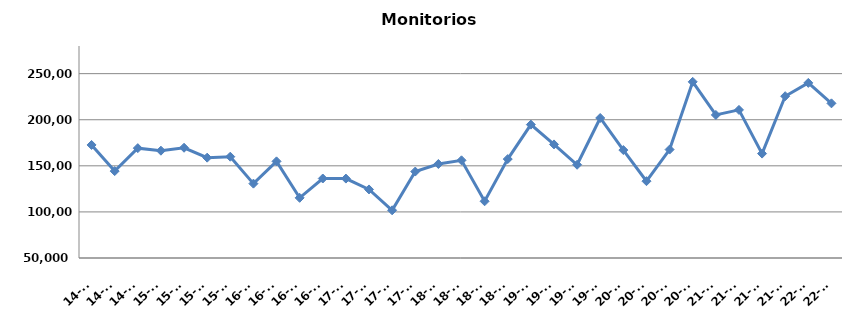
| Category | Monitorios ingresados |
|---|---|
| 14-T2 | 172648 |
| 14-T3 | 144262 |
| 14-T4 | 169174 |
| 15-T1 | 166433 |
| 15-T2 | 169612 |
| 15-T3 | 158859 |
| 15-T4 | 159890 |
| 16-T1 | 130680 |
| 16-T2 | 154860 |
| 16-T3 | 115269 |
| 16-T4 | 136245 |
| 17-T1 | 136155 |
| 17-T2 | 124382 |
| 17-T3 | 101751 |
| 17-T4 | 143788 |
| 18-T1 | 151974 |
| 18-T2 | 155991 |
| 18-T3 | 111544 |
| 18-T4 | 157337 |
| 19-T1 | 194715 |
| 19-T2 | 173225 |
| 19-T3 | 151156 |
| 19-T4 | 201895 |
| 20-T1 | 167095 |
| 20-T2 | 133351 |
| 20-T3 | 167630 |
| 20-T4 | 241119 |
| 21-T1 | 205212 |
| 21-T2 | 210679 |
| 21-T3 | 163259 |
| 21-T4 | 225536 |
| 22-T1 | 239972 |
| 22-T2 | 217801 |